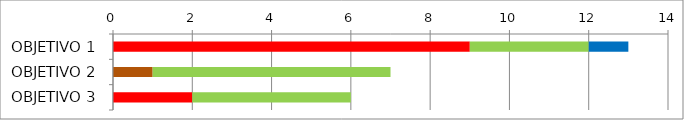
| Category | Series 0 | Series 1 | Series 2 | Series 3 | Series 4 | Series 5 |
|---|---|---|---|---|---|---|
| OBJETIVO 1 | 0 | 0 | 9 | 0 | 3 | 1 |
| OBJETIVO 2 | 1 | 0 | 0 | 0 | 6 | 0 |
| OBJETIVO 3 | 0 | 0 | 2 | 0 | 4 | 0 |